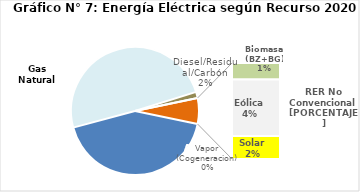
| Category | Series 0 |
|---|---|
| Agua | 1915.782 |
| Gas Natural | 2221.99 |
| Diesel/Residual/Carbón | 69.168 |
| Vapor (Cogeneracion) | 0.274 |
| Biomasa (BZ+BG) | 50.986 |
| Eólica | 173.608 |
| Solar | 70.43 |